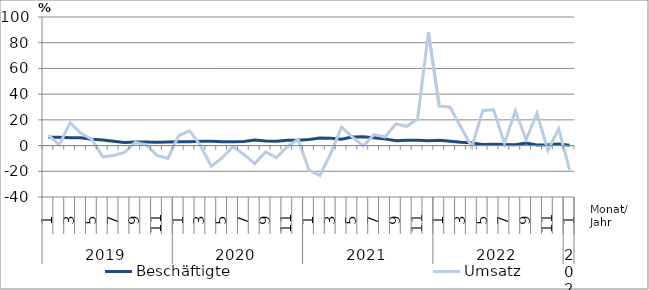
| Category | Beschäftigte | Umsatz |
|---|---|---|
| 0 | 6.4 | 8.2 |
| 1 | 6.5 | 0.6 |
| 2 | 6 | 17.8 |
| 3 | 6.1 | 9.6 |
| 4 | 4.9 | 4.9 |
| 5 | 4.3 | -8.8 |
| 6 | 3.3 | -7.7 |
| 7 | 2.4 | -5.4 |
| 8 | 2.8 | 2.4 |
| 9 | 2.7 | 0.5 |
| 10 | 2.5 | -7.6 |
| 11 | 2.7 | -10 |
| 12 | 2.9 | 7.8 |
| 13 | 2.9 | 11.5 |
| 14 | 3.4 | 0.1 |
| 15 | 3.4 | -16.1 |
| 16 | 2.9 | -9.5 |
| 17 | 2.9 | -0.8 |
| 18 | 3.1 | -6.9 |
| 19 | 4.3 | -14 |
| 20 | 3.6 | -4.9 |
| 21 | 3.4 | -9.4 |
| 22 | 4.1 | -0.9 |
| 23 | 4.1 | 4.9 |
| 24 | 4.8 | -19.1 |
| 25 | 5.8 | -23.3 |
| 26 | 5.6 | -6.1 |
| 27 | 5 | 14.4 |
| 28 | 6.6 | 6.6 |
| 29 | 6.9 | -0.3 |
| 30 | 6 | 8.7 |
| 31 | 5.2 | 6.7 |
| 32 | 3.8 | 16.9 |
| 33 | 4.2 | 15 |
| 34 | 4.2 | 20.6 |
| 35 | 3.7 | 88.1 |
| 36 | 4.1 | 30.7 |
| 37 | 3.4 | 29.8 |
| 38 | 2.6 | 14.1 |
| 39 | 2.1 | -1.1 |
| 40 | 0.9 | 27.1 |
| 41 | 1 | 27.9 |
| 42 | 0.8 | 1.7 |
| 43 | 0.7 | 27 |
| 44 | 2 | 4.7 |
| 45 | 0.5 | 25.1 |
| 46 | 0.7 | -3.7 |
| 47 | 1.3 | 13 |
| 48 | 0.3 | -18.9 |